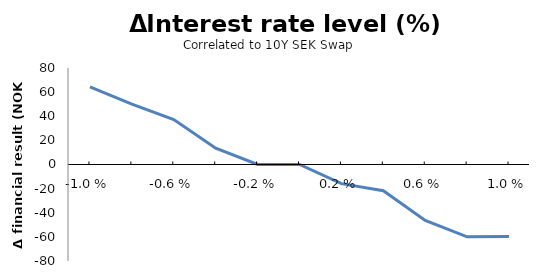
| Category | Series 0 |
|---|---|
| -0.01 | 64.291 |
| -0.008 | 50.091 |
| -0.006 | 37.247 |
| -0.004 | 13.527 |
| -0.002 | 0.1 |
| 0.0 | 0 |
| 0.002 | -15.873 |
| 0.004 | -21.712 |
| 0.006 | -46.312 |
| 0.008 | -59.92 |
| 0.01 | -59.764 |